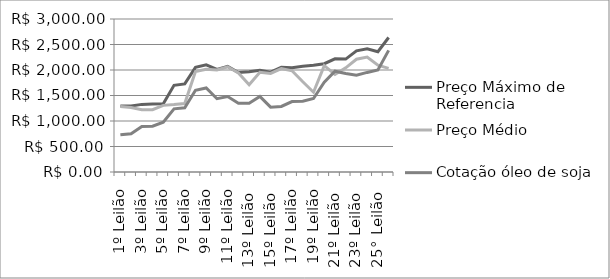
| Category | Preço Máximo de Referencia | Preço Médio | Cotação óleo de soja |
|---|---|---|---|
| 1º Leilão | 1294.68 | 1284.45 | 730.66 |
| 2º Leilão | 1292.25 | 1266.27 | 751.56 |
| 3º Leilão | 1325.92 | 1220.63 | 893.64 |
| 4º Leilão | 1330.9 | 1220.47 | 897.15 |
| 5º Leilão | 1336.12 | 1306.39 | 976.82 |
| 6º Leilão | 1699.8 | 1321.31 | 1238.57 |
| 7º Leilão | 1727.83 | 1341.37 | 1259 |
| 8º Leilão | 2051.43 | 1969.27 | 1602.97 |
| 9º Leilão | 2102.21 | 2013.16 | 1647.89 |
| 10º Leilão | 2011.71 | 1999.91 | 1437.13 |
| 11º Leilão | 2071 | 2062.86 | 1479.49 |
| 12º Leilão | 1951.42 | 1941.18 | 1348.95 |
| 13º Leilão  | 1965.6 | 1710.76 | 1350.09 |
| 14º Leilão  | 1996.83 | 1956.19 | 1482.3 |
| 15º Leilão  | 1958.13 | 1932.16 | 1270.92 |
| 16º Leilão | 2051.64 | 2028.82 | 1285.86 |
| 17º Leilão | 2046.35 | 1984.15 | 1381.76 |
| 18º Leilão  | 2073.37 | 1768.58 | 1387.93 |
| 19º Leilão | 2091.32 | 1563.98 | 1442.05 |
| 20º Leilão  | 2123.95 | 2084.25 | 1759.86 |
| 21º Leilão  | 2219.45 | 1912.47 | 1976.86 |
| 22º Leilão | 2214.11 | 2042.02 | 1931.67 |
| 23º Leilão  | 2374.62 | 2210.66 | 1897.12 |
| 24º Leilão  | 2414.84 | 2254.46 | 1952.51 |
| 25° Leilão  | 2358.69 | 2093.35 | 2000.35 |
| 26º Leilão  | 2636.95 | 2031.9 | 2384.95 |